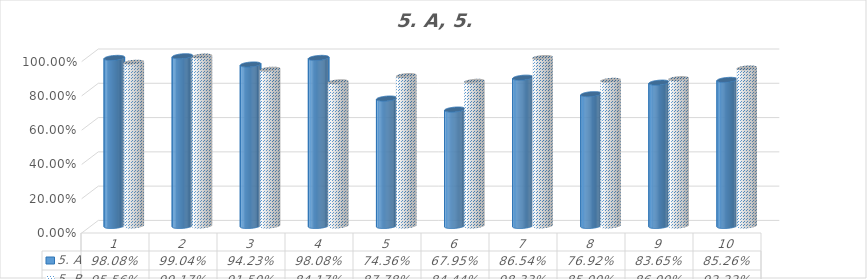
| Category | 5. A | 5. B |
|---|---|---|
| 1.0 | 0.981 | 0.956 |
| 2.0 | 0.99 | 0.992 |
| 3.0 | 0.942 | 0.915 |
| 4.0 | 0.981 | 0.842 |
| 5.0 | 0.744 | 0.878 |
| 6.0 | 0.679 | 0.844 |
| 7.0 | 0.865 | 0.983 |
| 8.0 | 0.769 | 0.85 |
| 9.0 | 0.837 | 0.86 |
| 10.0 | 0.853 | 0.922 |